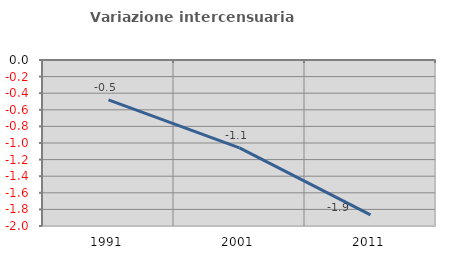
| Category | Variazione intercensuaria annua |
|---|---|
| 1991.0 | -0.479 |
| 2001.0 | -1.059 |
| 2011.0 | -1.866 |